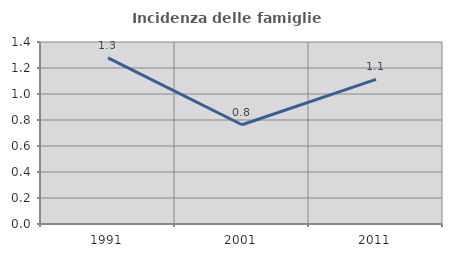
| Category | Incidenza delle famiglie numerose |
|---|---|
| 1991.0 | 1.278 |
| 2001.0 | 0.764 |
| 2011.0 | 1.113 |